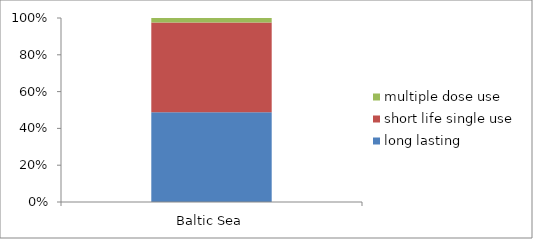
| Category | long lasting | short life single use | multiple dose use |
|---|---|---|---|
| Baltic Sea | 10337 | 10341 | 512 |